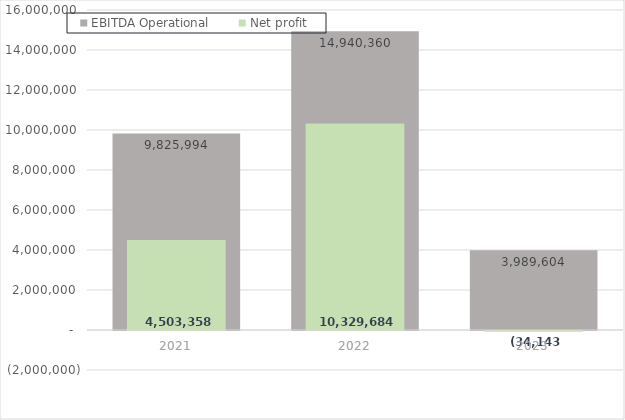
| Category | EBITDA Operational |
|---|---|
| 2021.0 | 9825993.565 |
| 2022.0 | 14940359.821 |
| 2023.0 | 3989604.316 |